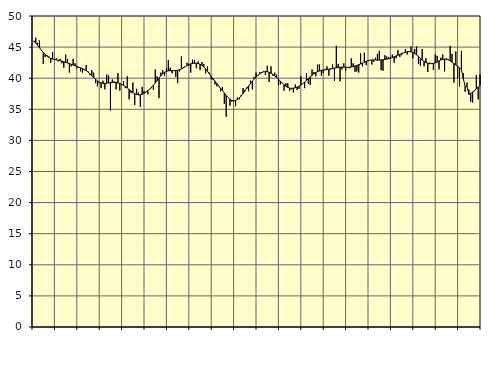
| Category | Piggar | Series 1 |
|---|---|---|
| nan | 45.9 | 46.01 |
| 1.0 | 46.5 | 45.63 |
| 1.0 | 45.7 | 45.26 |
| 1.0 | 46.1 | 44.88 |
| 1.0 | 44.4 | 44.5 |
| 1.0 | 42.3 | 44.15 |
| 1.0 | 43.4 | 43.84 |
| 1.0 | 43.7 | 43.56 |
| 1.0 | 43.5 | 43.33 |
| 1.0 | 42.5 | 43.18 |
| 1.0 | 44.2 | 43.07 |
| 1.0 | 43 | 43 |
| nan | 43.2 | 42.95 |
| 2.0 | 42.7 | 42.89 |
| 2.0 | 43.1 | 42.82 |
| 2.0 | 42.4 | 42.73 |
| 2.0 | 41.7 | 42.64 |
| 2.0 | 43.8 | 42.55 |
| 2.0 | 43.1 | 42.45 |
| 2.0 | 40.9 | 42.35 |
| 2.0 | 41.9 | 42.24 |
| 2.0 | 43.1 | 42.12 |
| 2.0 | 42.4 | 41.99 |
| 2.0 | 41.6 | 41.88 |
| nan | 41.8 | 41.77 |
| 3.0 | 41.1 | 41.66 |
| 3.0 | 40.9 | 41.54 |
| 3.0 | 41.3 | 41.4 |
| 3.0 | 42.1 | 41.22 |
| 3.0 | 41.1 | 40.99 |
| 3.0 | 40.5 | 40.71 |
| 3.0 | 41.3 | 40.41 |
| 3.0 | 40.9 | 40.12 |
| 3.0 | 39.2 | 39.83 |
| 3.0 | 38.7 | 39.57 |
| 3.0 | 39.2 | 39.37 |
| nan | 38.4 | 39.24 |
| 4.0 | 39.6 | 39.17 |
| 4.0 | 38.2 | 39.16 |
| 4.0 | 40.6 | 39.19 |
| 4.0 | 40.4 | 39.24 |
| 4.0 | 34.8 | 39.29 |
| 4.0 | 39.8 | 39.33 |
| 4.0 | 39.5 | 39.34 |
| 4.0 | 38.2 | 39.31 |
| 4.0 | 40.8 | 39.24 |
| 4.0 | 38 | 39.15 |
| 4.0 | 38.9 | 39.02 |
| nan | 39.5 | 38.86 |
| 5.0 | 38.4 | 38.66 |
| 5.0 | 40.3 | 38.43 |
| 5.0 | 36.6 | 38.19 |
| 5.0 | 37.6 | 37.94 |
| 5.0 | 39.3 | 37.72 |
| 5.0 | 35.7 | 37.53 |
| 5.0 | 38.3 | 37.39 |
| 5.0 | 37.7 | 37.32 |
| 5.0 | 35.4 | 37.33 |
| 5.0 | 38.6 | 37.41 |
| 5.0 | 37.9 | 37.56 |
| nan | 37.8 | 37.77 |
| 6.0 | 37.4 | 38 |
| 6.0 | 38.2 | 38.26 |
| 6.0 | 38.4 | 38.54 |
| 6.0 | 38.1 | 38.87 |
| 6.0 | 41.4 | 39.23 |
| 6.0 | 40.3 | 39.62 |
| 6.0 | 36.8 | 40.03 |
| 6.0 | 40.9 | 40.4 |
| 6.0 | 41.3 | 40.71 |
| 6.0 | 40.4 | 40.95 |
| 6.0 | 41.6 | 41.1 |
| nan | 42.9 | 41.18 |
| 7.0 | 41.7 | 41.21 |
| 7.0 | 40.8 | 41.22 |
| 7.0 | 41.3 | 41.22 |
| 7.0 | 40.2 | 41.24 |
| 7.0 | 39.2 | 41.28 |
| 7.0 | 41.1 | 41.35 |
| 7.0 | 43.5 | 41.48 |
| 7.0 | 41.8 | 41.66 |
| 7.0 | 41.9 | 41.85 |
| 7.0 | 42.5 | 42.03 |
| 7.0 | 42 | 42.2 |
| nan | 40.9 | 42.31 |
| 8.0 | 43 | 42.38 |
| 8.0 | 42.9 | 42.41 |
| 8.0 | 41.6 | 42.4 |
| 8.0 | 42.7 | 42.35 |
| 8.0 | 41.3 | 42.25 |
| 8.0 | 42.6 | 42.08 |
| 8.0 | 42.3 | 41.82 |
| 8.0 | 40.8 | 41.49 |
| 8.0 | 41.9 | 41.11 |
| 8.0 | 40.9 | 40.7 |
| 8.0 | 39.8 | 40.29 |
| nan | 39.7 | 39.9 |
| 9.0 | 39 | 39.52 |
| 9.0 | 38.7 | 39.14 |
| 9.0 | 38.7 | 38.77 |
| 9.0 | 37.9 | 38.39 |
| 9.0 | 38.6 | 38.01 |
| 9.0 | 35.9 | 37.62 |
| 9.0 | 33.8 | 37.23 |
| 9.0 | 36.9 | 36.89 |
| 9.0 | 35.6 | 36.62 |
| 9.0 | 36.2 | 36.43 |
| 9.0 | 36.3 | 36.36 |
| nan | 35.5 | 36.41 |
| 10.0 | 36.9 | 36.57 |
| 10.0 | 36.6 | 36.82 |
| 10.0 | 37.3 | 37.15 |
| 10.0 | 38.4 | 37.53 |
| 10.0 | 38.1 | 37.94 |
| 10.0 | 38.5 | 38.34 |
| 10.0 | 37.9 | 38.75 |
| 10.0 | 39.6 | 39.14 |
| 10.0 | 38.2 | 39.52 |
| 10.0 | 40.2 | 39.87 |
| 10.0 | 40.9 | 40.19 |
| nan | 40.4 | 40.47 |
| 11.0 | 41 | 40.71 |
| 11.0 | 41 | 40.9 |
| 11.0 | 41.1 | 41.02 |
| 11.0 | 40.5 | 41.07 |
| 11.0 | 42 | 41.04 |
| 11.0 | 39.4 | 40.95 |
| 11.0 | 41.9 | 40.8 |
| 11.0 | 40.4 | 40.61 |
| 11.0 | 40.9 | 40.38 |
| 11.0 | 40.6 | 40.12 |
| 11.0 | 38.9 | 39.84 |
| nan | 39 | 39.53 |
| 12.0 | 39.2 | 39.23 |
| 12.0 | 38 | 38.95 |
| 12.0 | 39.2 | 38.71 |
| 12.0 | 39.2 | 38.52 |
| 12.0 | 38 | 38.41 |
| 12.0 | 38.2 | 38.37 |
| 12.0 | 37.7 | 38.39 |
| 12.0 | 39 | 38.46 |
| 12.0 | 38.1 | 38.57 |
| 12.0 | 38.3 | 38.72 |
| 12.0 | 40.3 | 38.9 |
| nan | 39.1 | 39.12 |
| 13.0 | 38.4 | 39.37 |
| 13.0 | 40.8 | 39.64 |
| 13.0 | 39.1 | 39.92 |
| 13.0 | 38.9 | 40.2 |
| 13.0 | 41.4 | 40.47 |
| 13.0 | 41 | 40.71 |
| 13.0 | 40.3 | 40.92 |
| 13.0 | 42.2 | 41.06 |
| 13.0 | 42.2 | 41.17 |
| 13.0 | 40.4 | 41.25 |
| 13.0 | 40.8 | 41.31 |
| nan | 41.5 | 41.35 |
| 14.0 | 41.9 | 41.4 |
| 14.0 | 40.4 | 41.45 |
| 14.0 | 41.4 | 41.5 |
| 14.0 | 42.2 | 41.55 |
| 14.0 | 39.6 | 41.61 |
| 14.0 | 45.2 | 41.67 |
| 14.0 | 42.3 | 41.72 |
| 14.0 | 39.5 | 41.77 |
| 14.0 | 41.4 | 41.78 |
| 14.0 | 42.4 | 41.78 |
| 14.0 | 41.2 | 41.77 |
| nan | 41.8 | 41.76 |
| 15.0 | 41.6 | 41.76 |
| 15.0 | 43.2 | 41.8 |
| 15.0 | 42.4 | 41.87 |
| 15.0 | 41 | 41.96 |
| 15.0 | 41.1 | 42.07 |
| 15.0 | 40.9 | 42.18 |
| 15.0 | 44 | 42.28 |
| 15.0 | 41.9 | 42.41 |
| 15.0 | 44.1 | 42.56 |
| 15.0 | 42.1 | 42.7 |
| 15.0 | 42.9 | 42.81 |
| nan | 42.9 | 42.9 |
| 16.0 | 42.2 | 42.94 |
| 16.0 | 42.6 | 42.94 |
| 16.0 | 43.3 | 42.93 |
| 16.0 | 43.9 | 42.91 |
| 16.0 | 44.4 | 42.91 |
| 16.0 | 41.3 | 42.93 |
| 16.0 | 41.2 | 42.97 |
| 16.0 | 43.7 | 43.01 |
| 16.0 | 43.5 | 43.06 |
| 16.0 | 43.4 | 43.13 |
| 16.0 | 43.5 | 43.21 |
| nan | 43.8 | 43.32 |
| 17.0 | 42.5 | 43.44 |
| 17.0 | 43.2 | 43.57 |
| 17.0 | 44.5 | 43.7 |
| 17.0 | 43.4 | 43.83 |
| 17.0 | 43.7 | 43.95 |
| 17.0 | 44.1 | 44.06 |
| 17.0 | 44.7 | 44.17 |
| 17.0 | 43.8 | 44.25 |
| 17.0 | 44.2 | 44.28 |
| 17.0 | 45.1 | 44.24 |
| 17.0 | 43.2 | 44.14 |
| nan | 44.7 | 43.97 |
| 18.0 | 45.1 | 43.74 |
| 18.0 | 42.3 | 43.48 |
| 18.0 | 42 | 43.2 |
| 18.0 | 44.7 | 42.92 |
| 18.0 | 41.9 | 42.69 |
| 18.0 | 43.2 | 42.51 |
| 18.0 | 41 | 42.4 |
| 18.0 | 42.5 | 42.34 |
| 18.0 | 42.3 | 42.34 |
| 18.0 | 41.3 | 42.39 |
| 18.0 | 43.8 | 42.48 |
| nan | 43.6 | 42.61 |
| 19.0 | 41.4 | 42.77 |
| 19.0 | 43.3 | 42.92 |
| 19.0 | 43.8 | 43.03 |
| 19.0 | 41.1 | 43.07 |
| 19.0 | 43.2 | 43.04 |
| 19.0 | 43 | 42.93 |
| 19.0 | 45.2 | 42.77 |
| 19.0 | 43.9 | 42.58 |
| 19.0 | 39.3 | 42.36 |
| 19.0 | 44.3 | 42.12 |
| 19.0 | 40 | 41.88 |
| nan | 38.7 | 41.64 |
| 20.0 | 44.4 | 41.43 |
| 20.0 | 40.8 | 39.97 |
| 20.0 | 37.8 | 38.68 |
| 20.0 | 39.3 | 38.7 |
| 20.0 | 38.2 | 37.39 |
| 20.0 | 36.2 | 37.57 |
| 20.0 | 36.1 | 37.78 |
| 20.0 | 37.9 | 38.02 |
| 20.0 | 40.5 | 38.28 |
| 20.0 | 36.6 | 38.56 |
| 20.0 | 40.6 | 38.83 |